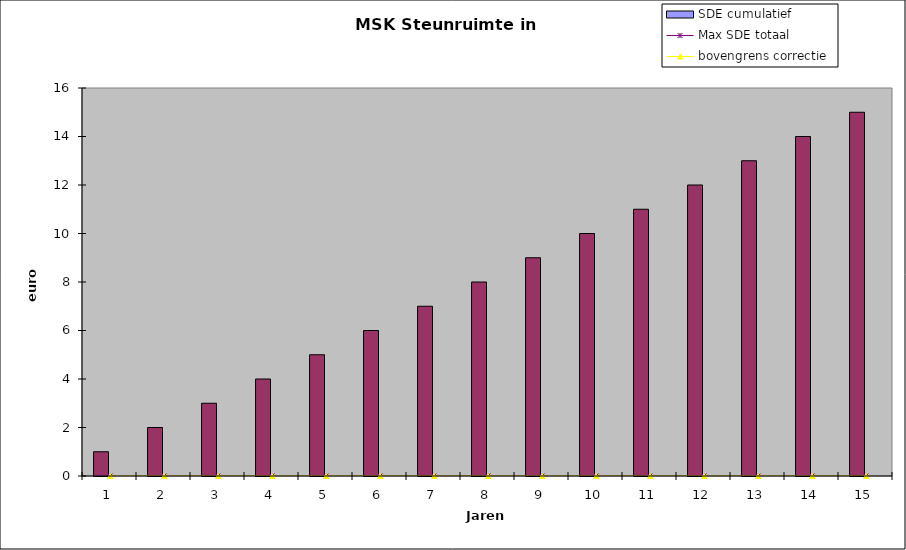
| Category | jaar | SDE cumulatief |
|---|---|---|
| 0 | 1 | 0 |
| 1 | 2 | 0 |
| 2 | 3 | 0 |
| 3 | 4 | 0 |
| 4 | 5 | 0 |
| 5 | 6 | 0 |
| 6 | 7 | 0 |
| 7 | 8 | 0 |
| 8 | 9 | 0 |
| 9 | 10 | 0 |
| 10 | 11 | 0 |
| 11 | 12 | 0 |
| 12 | 13 | 0 |
| 13 | 14 | 0 |
| 14 | 15 | 0 |